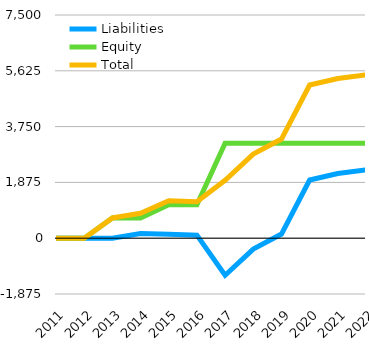
| Category | Liabilities  | Equity  | Total |
|---|---|---|---|
| 2011 | 0 | -0.571 | -0.571 |
| 2012 | 0 | -0.571 | -0.571 |
| 2013 | 0 | 678.962 | 678.962 |
| 2014 | 157.274 | 678.962 | 836.236 |
| 2015 | 135.184 | 1124.44 | 1259.624 |
| 2016 | 101.72 | 1121.449 | 1223.169 |
| 2017 | -1245.112 | 3193.128 | 1948.016 |
| 2018 | -365.425 | 3193.128 | 2827.703 |
| 2019 | 138.412 | 3193.128 | 3331.54 |
| 2020 | 1954.112 | 3193.128 | 5147.24 |
| 2021 | 2172.112 | 3193.128 | 5365.24 |
| 2022 | 2297.112 | 3193.128 | 5490.24 |